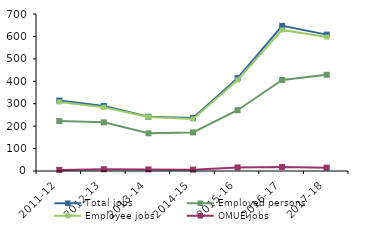
| Category | Total jobs | Employed persons | Employee jobs | OMUE jobs |
|---|---|---|---|---|
| 2011-12 | 314 | 223 | 308 | 5 |
| 2012-13 | 290 | 217 | 284 | 8 |
| 2013-14 | 242 | 168 | 241 | 7 |
| 2014-15 | 236 | 172 | 232 | 6 |
| 2015-16 | 414 | 271 | 406 | 16 |
| 2016-17 | 647 | 406 | 629 | 18 |
| 2017-18 | 608 | 429 | 597 | 15 |